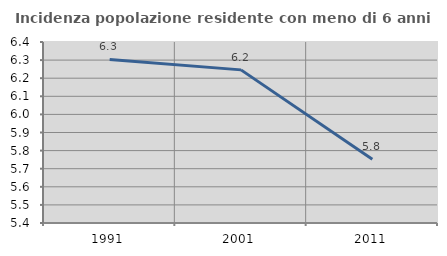
| Category | Incidenza popolazione residente con meno di 6 anni |
|---|---|
| 1991.0 | 6.303 |
| 2001.0 | 6.246 |
| 2011.0 | 5.753 |